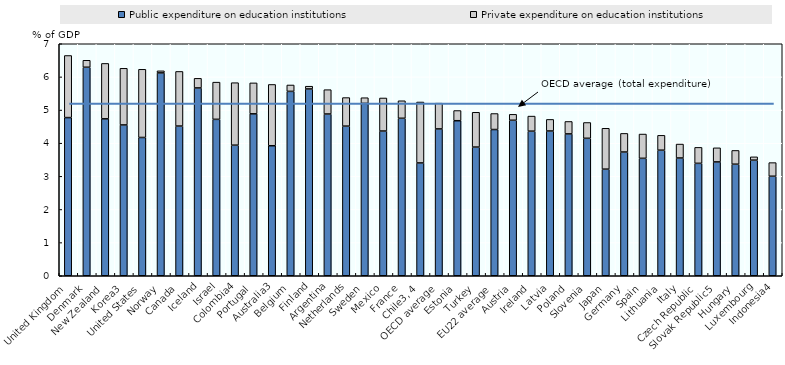
| Category | Public expenditure on education institutions | Private expenditure on education institutions |
|---|---|---|
| United Kingdom | 4.772 | 1.874 |
| Denmark | 6.291 | 0.21 |
| New Zealand | 4.735 | 1.671 |
| Korea3 | 4.551 | 1.709 |
| United States | 4.172 | 2.057 |
| Norway | 6.121 | 0.062 |
| Canada | 4.517 | 1.648 |
| Iceland | 5.667 | 0.29 |
| Israel | 4.719 | 1.123 |
| Colombia4 | 3.94 | 1.885 |
| Portugal | 4.885 | 0.934 |
| Australia3 | 3.923 | 1.849 |
| Belgium | 5.563 | 0.192 |
| Finland | 5.636 | 0.083 |
| Argentina | 4.88 | 0.735 |
| Netherlands | 4.515 | 0.861 |
| Sweden | 5.2 | 0.172 |
| Mexico | 4.367 | 0.997 |
| France | 4.752 | 0.528 |
| Chile3, 4 | 3.404 | 1.839 |
| OECD average | 4.43 | 0.778 |
| Estonia | 4.678 | 0.308 |
| Turkey | 3.882 | 1.05 |
| EU22 average | 4.412 | 0.483 |
| Austria | 4.691 | 0.179 |
| Ireland | 4.363 | 0.455 |
| Latvia | 4.368 | 0.349 |
| Poland | 4.28 | 0.375 |
| Slovenia | 4.148 | 0.476 |
| Japan | 3.217 | 1.233 |
| Germany | 3.733 | 0.562 |
| Spain | 3.543 | 0.732 |
| Lithuania | 3.789 | 0.448 |
| Italy | 3.553 | 0.421 |
| Czech Republic | 3.392 | 0.482 |
| Slovak Republic5 | 3.435 | 0.425 |
| Hungary | 3.366 | 0.416 |
| Luxembourg | 3.488 | 0.1 |
| Indonesia4 | 3.003 | 0.411 |